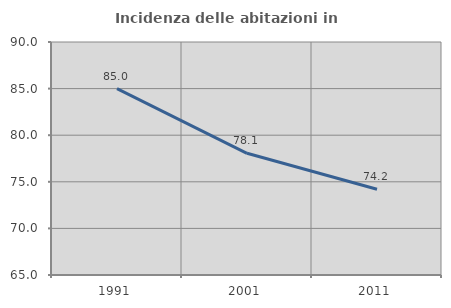
| Category | Incidenza delle abitazioni in proprietà  |
|---|---|
| 1991.0 | 85 |
| 2001.0 | 78.056 |
| 2011.0 | 74.194 |